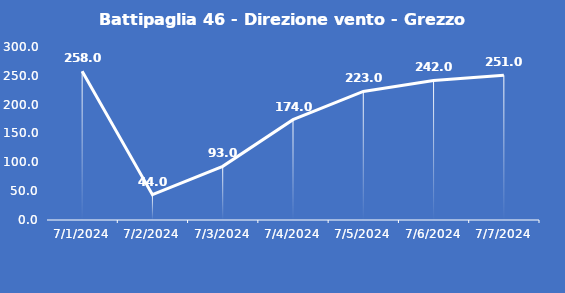
| Category | Battipaglia 46 - Direzione vento - Grezzo (°N) |
|---|---|
| 7/1/24 | 258 |
| 7/2/24 | 44 |
| 7/3/24 | 93 |
| 7/4/24 | 174 |
| 7/5/24 | 223 |
| 7/6/24 | 242 |
| 7/7/24 | 251 |